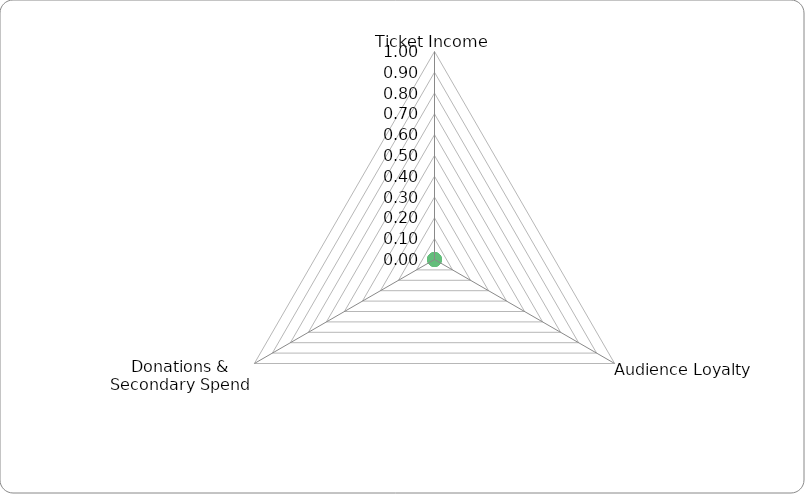
| Category | Series 0 |
|---|---|
| Ticket Income | 0 |
| Audience Loyalty | 0 |
| Donations & Secondary Spend | 0 |